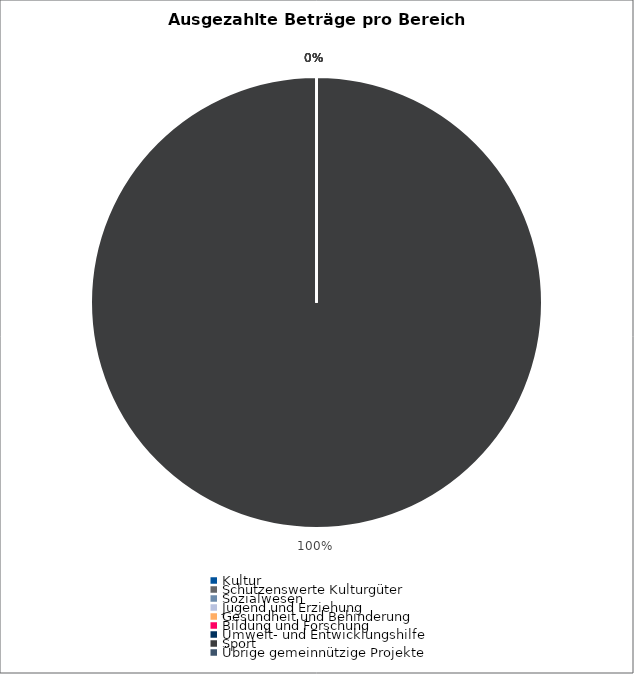
| Category | Series 0 |
|---|---|
| Kultur | 0 |
| Schützenswerte Kulturgüter | 0 |
| Sozialwesen | 0 |
| Jugend und Erziehung | 0 |
| Gesundheit und Behinderung | 0 |
| Bildung und Forschung | 0 |
| Umwelt- und Entwicklungshilfe | 0 |
| Sport | 422836.7 |
| Übrige gemeinnützige Projekte | 0 |